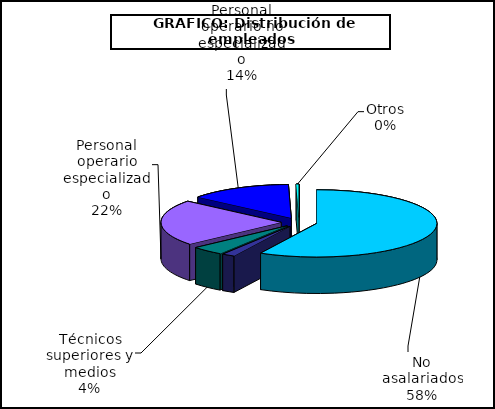
| Category | Series 0 |
|---|---|
| No asalariados | 9324 |
| Administrativos | 278 |
| Técnicos superiores y medios | 701 |
| Personal operario especializado | 3559 |
| Personal operario no especializado | 2228 |
| Otros | 61 |